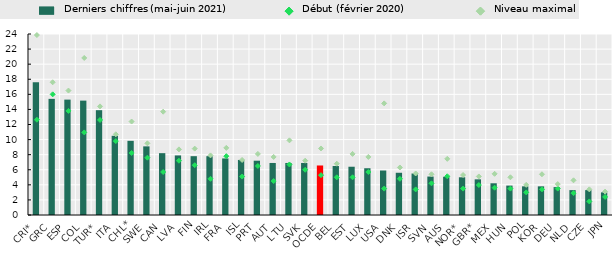
| Category | Derniers chiffres (mai-juin 2021) |
|---|---|
| CRI* | 17.597 |
| GRC | 15.4 |
| ESP | 15.3 |
| COL | 15.166 |
| TUR* | 13.9 |
| ITA | 10.5 |
| CHL* | 9.836 |
| SWE | 9.1 |
| CAN | 8.2 |
| LVA | 7.9 |
| FIN | 7.8 |
| IRL | 7.8 |
| FRA | 7.5 |
| ISL | 7.3 |
| PRT | 7.2 |
| AUT | 6.9 |
| LTU | 6.9 |
| SVK | 6.9 |
| OCDE | 6.566 |
| BEL | 6.5 |
| EST | 6.4 |
| LUX | 6.2 |
| USA | 5.9 |
| DNK | 5.6 |
| ISR | 5.505 |
| SVN | 5.1 |
| AUS | 5.071 |
| NOR* | 5 |
| GBR* | 4.729 |
| MEX | 4.206 |
| HUN | 3.9 |
| POL | 3.8 |
| KOR | 3.8 |
| DEU | 3.7 |
| NLD | 3.3 |
| CZE | 3.3 |
| JPN | 3 |